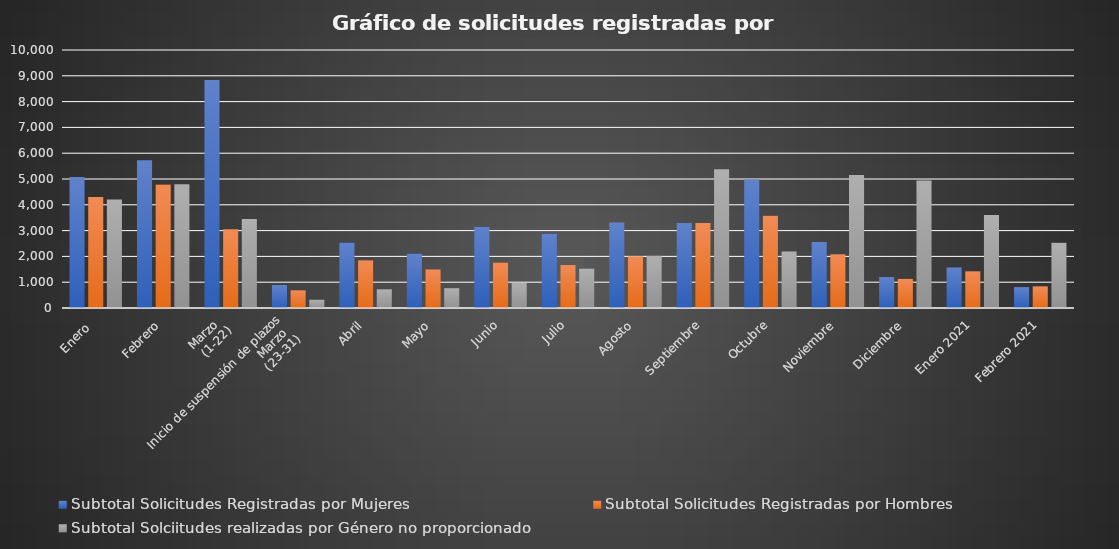
| Category | Subtotal Solicitudes Registradas por Mujeres | Subtotal Solicitudes Registradas por Hombres | Subtotal Solciitudes realizadas por Género no proporcionado |
|---|---|---|---|
| Enero  | 5076 | 4300 | 4209 |
| Febrero | 5724 | 4786 | 4793 |
| Marzo 
(1-22) | 8833 | 3055 | 3446 |
| Inicio de suspensión de plazos
Marzo 
(23-31) | 891 | 686 | 322 |
| Abril | 2534 | 1847 | 725 |
| Mayo | 2111 | 1493 | 767 |
| Junio | 3151 | 1761 | 967 |
| Julio | 2879 | 1665 | 1529 |
| Agosto | 3317 | 1996 | 2024 |
| Septiembre | 3297 | 3298 | 5376 |
| Octubre | 4974 | 3579 | 2191 |
| Noviembre | 2556 | 2081 | 5158 |
| Diciembre | 1199 | 1128 | 4946 |
| Enero 2021 | 1572 | 1422 | 3600 |
| Febrero 2021 | 810 | 840 | 2532 |